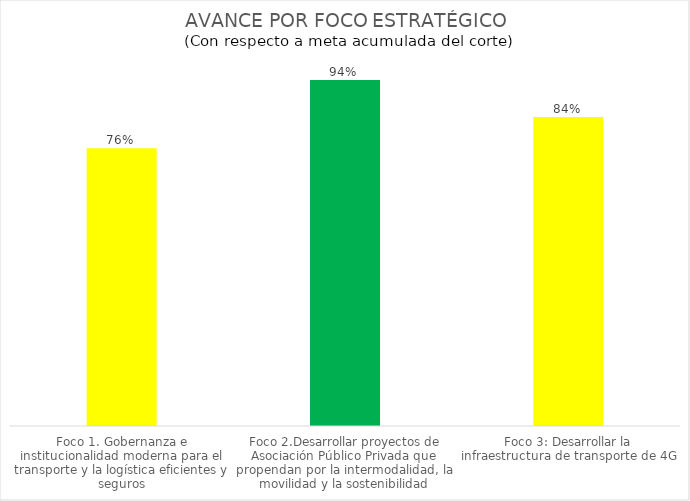
| Category | Series 0 |
|---|---|
| Foco 1. Gobernanza e institucionalidad moderna para el transporte y la logística eficientes y seguros | 0.755 |
| Foco 2.Desarrollar proyectos de Asociación Público Privada que propendan por la intermodalidad, la movilidad y la sostenibilidad | 0.94 |
| Foco 3: Desarrollar la infraestructura de transporte de 4G | 0.84 |